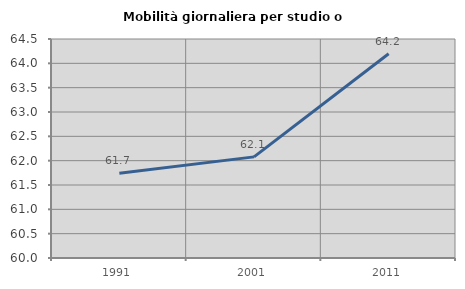
| Category | Mobilità giornaliera per studio o lavoro |
|---|---|
| 1991.0 | 61.741 |
| 2001.0 | 62.078 |
| 2011.0 | 64.198 |